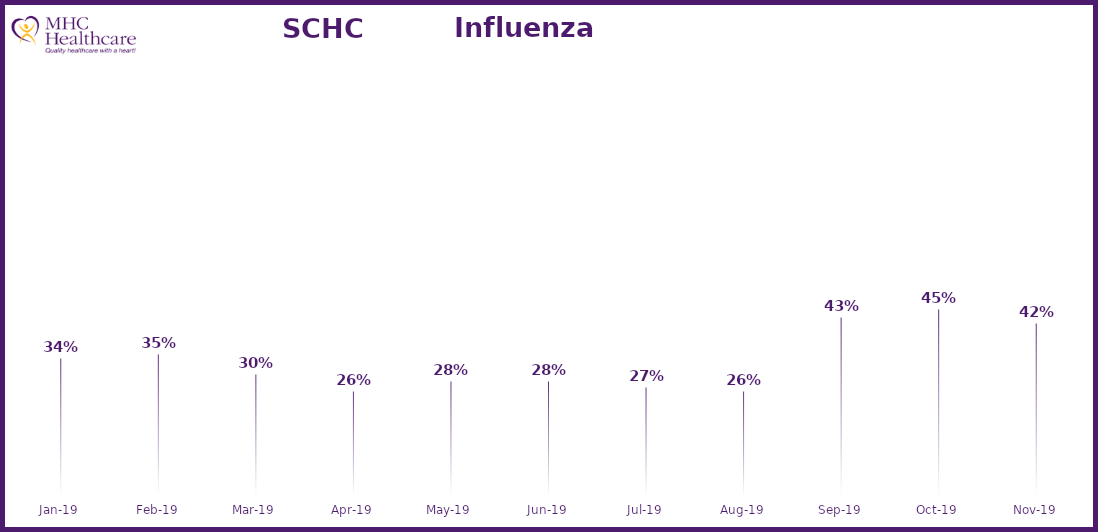
| Category | Online Access to Health Information |
|---|---|
| 2019-01-01 | 0.335 |
| 2019-02-01 | 0.345 |
| 2019-03-01 | 0.3 |
| 2019-04-01 | 0.26 |
| 2019-05-01 | 0.284 |
| 2019-06-01 | 0.284 |
| 2019-07-01 | 0.27 |
| 2019-08-01 | 0.26 |
| 2019-09-01 | 0.429 |
| 2019-10-01 | 0.445 |
| 2019-11-01 | 0.415 |